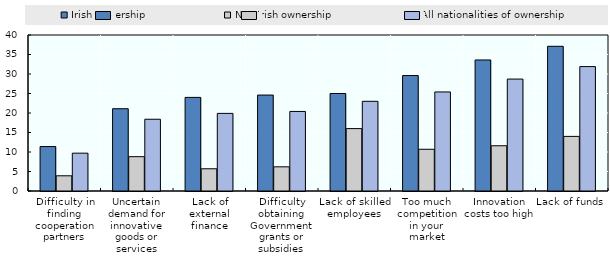
| Category | Irish ownership | Non Irish ownership | All nationalities of ownership |
|---|---|---|---|
| Difficulty in finding cooperation partners | 11.4 | 3.9 | 9.7 |
| Uncertain demand for innovative goods or services | 21.1 | 8.8 | 18.4 |
| Lack of external finance | 24 | 5.7 | 19.9 |
| Difficulty obtaining Government grants or subsidies | 24.6 | 6.2 | 20.4 |
| Lack of skilled employees | 25 | 16 | 23 |
| Too much competition in your market | 29.6 | 10.7 | 25.4 |
| Innovation costs too high | 33.6 | 11.6 | 28.7 |
| Lack of funds | 37.1 | 14 | 31.9 |